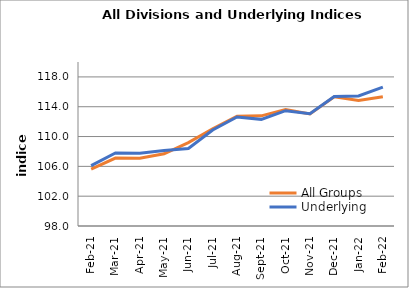
| Category | All Groups | Underlying |
|---|---|---|
| 2021-02-01 | 105.627 | 106.099 |
| 2021-03-01 | 107.11 | 107.788 |
| 2021-04-01 | 107.082 | 107.772 |
| 2021-05-01 | 107.693 | 108.128 |
| 2021-06-01 | 109.193 | 108.399 |
| 2021-07-01 | 111.039 | 110.883 |
| 2021-08-01 | 112.735 | 112.633 |
| 2021-09-01 | 112.778 | 112.306 |
| 2021-10-01 | 113.609 | 113.469 |
| 2021-11-01 | 113.04 | 113.069 |
| 2021-12-01 | 115.332 | 115.373 |
| 2022-01-01 | 114.841 | 115.444 |
| 2022-02-01 | 115.348 | 116.622 |